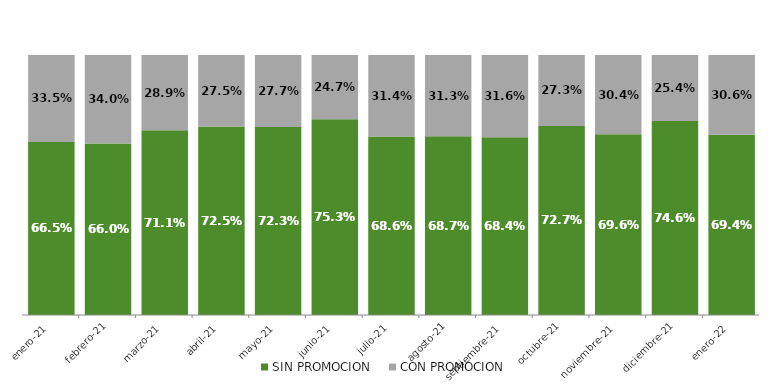
| Category | SIN PROMOCION   | CON PROMOCION   |
|---|---|---|
| 2021-01-01 | 0.665 | 0.335 |
| 2021-02-01 | 0.66 | 0.34 |
| 2021-03-01 | 0.711 | 0.289 |
| 2021-04-01 | 0.725 | 0.275 |
| 2021-05-01 | 0.723 | 0.277 |
| 2021-06-01 | 0.753 | 0.247 |
| 2021-07-01 | 0.686 | 0.314 |
| 2021-08-01 | 0.687 | 0.313 |
| 2021-09-01 | 0.684 | 0.316 |
| 2021-10-01 | 0.727 | 0.273 |
| 2021-11-01 | 0.696 | 0.304 |
| 2021-12-01 | 0.746 | 0.254 |
| 2022-01-01 | 0.694 | 0.306 |